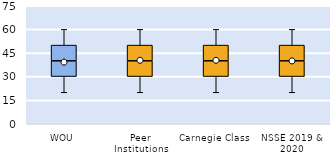
| Category | 25th | 50th | 75th |
|---|---|---|---|
| WOU | 30 | 10 | 10 |
| Peer Institutions | 30 | 10 | 10 |
| Carnegie Class | 30 | 10 | 10 |
| NSSE 2019 & 2020 | 30 | 10 | 10 |